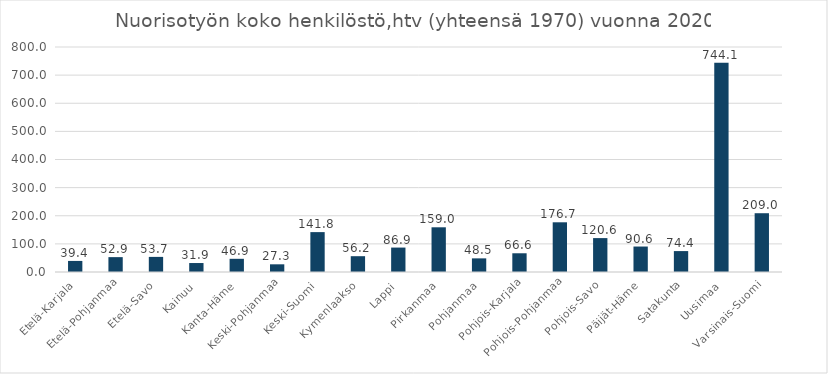
| Category | Nuorisotyön koko henkilöstö (htv) 2020 |
|---|---|
| Etelä-Karjala | 39.35 |
| Etelä-Pohjanmaa | 52.85 |
| Etelä-Savo | 53.71 |
| Kainuu | 31.9 |
| Kanta-Häme | 46.9 |
| Keski-Pohjanmaa | 27.34 |
| Keski-Suomi | 141.83 |
| Kymenlaakso | 56.2 |
| Lappi | 86.86 |
| Pirkanmaa | 158.95 |
| Pohjanmaa | 48.47 |
| Pohjois-Karjala | 66.58 |
| Pohjois-Pohjanmaa | 176.72 |
| Pohjois-Savo | 120.55 |
| Päijät-Häme | 90.56 |
| Satakunta | 74.38 |
| Uusimaa | 744.07 |
| Varsinais-Suomi | 209 |